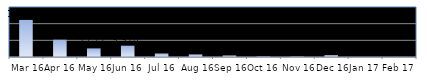
| Category | Series 0 |
|---|---|
| Mar 16 | 11120 |
| Apr 16 | 5167 |
| May 16 | 2577 |
| Jun 16 | 3370 |
| Jul 16 | 1026 |
| Aug 16 | 782 |
| Sep 16 | 442 |
| Oct 16 | 178 |
| Nov 16 | 121 |
| Dec 16 | 566 |
| Jan 17 | 8 |
| Feb 17 | 16 |